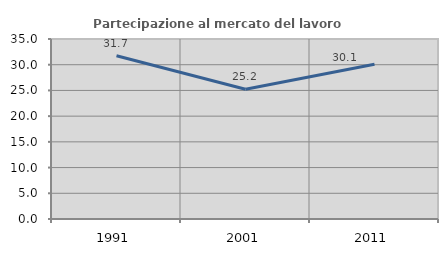
| Category | Partecipazione al mercato del lavoro  femminile |
|---|---|
| 1991.0 | 31.737 |
| 2001.0 | 25.227 |
| 2011.0 | 30.101 |